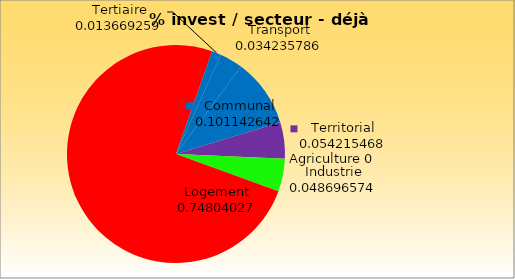
| Category | % |
|---|---|
| Territorial | 0.054 |
| Agriculture | 0 |
| Industrie | 0.049 |
| Logement | 0.748 |
| Tertiaire | 0.014 |
| Transport | 0.034 |
| Communal | 0.101 |